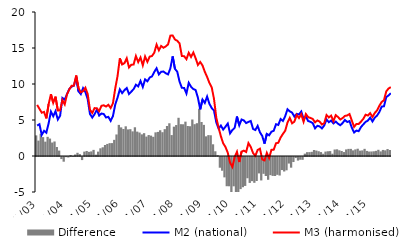
| Category | Difference |
|---|---|
| 1/03 | 2.864 |
| 2 | 2.139 |
| 3 | 3.084 |
| 4 | 2.623 |
| 5 | 1.993 |
| 6 | 2.66 |
| 7 | 2.419 |
| 8 | 1.871 |
| 9 | 2.018 |
| 10 | 1.248 |
| 11 | 0.751 |
| 12 | -0.286 |
| 1/04 | -0.652 |
| 2 | -0.02 |
| 3 | -0.069 |
| 4 | 0.128 |
| 5 | 0.006 |
| 6 | 0.209 |
| 7 | 0.446 |
| 8 | 0.265 |
| 9 | -0.428 |
| 10 | 0.607 |
| 11 | 0.699 |
| 12 | 0.577 |
|  1/05 | 0.638 |
| 2 | 0.85 |
| 3 | 0.185 |
| 4 | 0.609 |
| 5 | 1.069 |
| 6 | 1.212 |
| 7 | 1.525 |
| 8 | 1.675 |
| 9 | 1.784 |
| 10 | 1.792 |
| 11 | 2.244 |
| 12 | 2.992 |
|  1/06 | 4.322 |
| 2 | 3.975 |
| 3 | 3.752 |
| 4 | 4.124 |
| 5 | 3.694 |
| 6 | 3.726 |
| 7 | 3.42 |
| 8 | 3.989 |
| 9 | 3.387 |
| 10 | 3.26 |
| 11 | 3.006 |
| 12 | 3.172 |
|  1/07 | 2.696 |
| 2 | 2.91 |
| 3 | 2.833 |
| 4 | 2.666 |
| 5 | 3.283 |
| 6 | 3.345 |
| 7 | 3.578 |
| 8 | 3.306 |
| 9 | 3.73 |
| 10 | 4.166 |
| 11 | 4.546 |
| 12 | 2.906 |
|  1/08 | 4.073 |
| 2 | 4.299 |
| 3 | 5.308 |
| 4 | 4.418 |
| 5 | 4.406 |
| 6 | 4.77 |
| 7 | 4.166 |
| 8 | 4.133 |
| 9 | 5.069 |
| 10 | 4.418 |
| 11 | 4.555 |
| 12 | 6.576 |
|  1/09 | 4.726 |
| 2 | 4.323 |
| 3 | 2.73 |
| 4 | 2.901 |
| 5 | 2.879 |
| 6 | 1.627 |
| 7 | 0.655 |
| 8 | 0.123 |
| 9 | -1.49 |
| 10 | -1.907 |
| 11 | -2.829 |
| 12 | -4.059 |
|  1/10 | -4.068 |
| 2 | -5.121 |
| 3 | -4.072 |
| 4 | -4.899 |
| 5 | -5.099 |
| 6 | -4.461 |
| 7 | -4.199 |
| 8 | -4.018 |
| 9 | -2.951 |
| 10 | -3.6 |
| 11 | -3.354 |
| 12 | -3.585 |
|  1/11 | -3.331 |
| 2 | -2.279 |
| 3 | -3.255 |
| 4 | -2.338 |
| 5 | -2.641 |
| 6 | -3.165 |
| 7 | -2.519 |
| 8 | -2.624 |
| 9 | -2.643 |
| 10 | -2.476 |
| 11 | -2.573 |
| 12 | -1.813 |
|  1/12 | -2.015 |
| 2 | -1.849 |
| 3 | -0.91 |
| 4 | -1.483 |
| 5 | -0.699 |
| 6 | -0.144 |
| 7 | -0.496 |
| 8 | -0.38 |
| 9 | -0.392 |
| 10 | 0.327 |
| 11 | 0.533 |
| 12 | 0.538 |
|  1/13 | 0.58 |
| 2 | 0.83 |
| 3 | 0.754 |
| 4 | 0.661 |
| 5 | 0.545 |
| 6 | 0.312 |
| 7 | 0.615 |
| 8 | 0.661 |
| 9 | 0.681 |
| 10 | 0.317 |
| 11 | 0.901 |
| 12 | 0.928 |
|  1/14 | 0.792 |
| 2 | 0.695 |
| 3 | 0.547 |
| 4 | 0.915 |
| 5 | 0.988 |
| 6 | 0.99 |
| 7 | 0.782 |
| 8 | 0.915 |
| 9 | 1.012 |
| 10 | 0.745 |
| 11 | 0.776 |
| 12 | 0.994 |
|  1/15 | 0.704 |
| 2 | 0.618 |
| 3 | 0.627 |
| 4 | 0.654 |
| 5 | 0.715 |
| 6 | 0.862 |
| 7 | 0.64 |
| 8 | 0.842 |
| 9 | 0.785 |
| 10 | 0.965 |
| 11 | 0.836 |